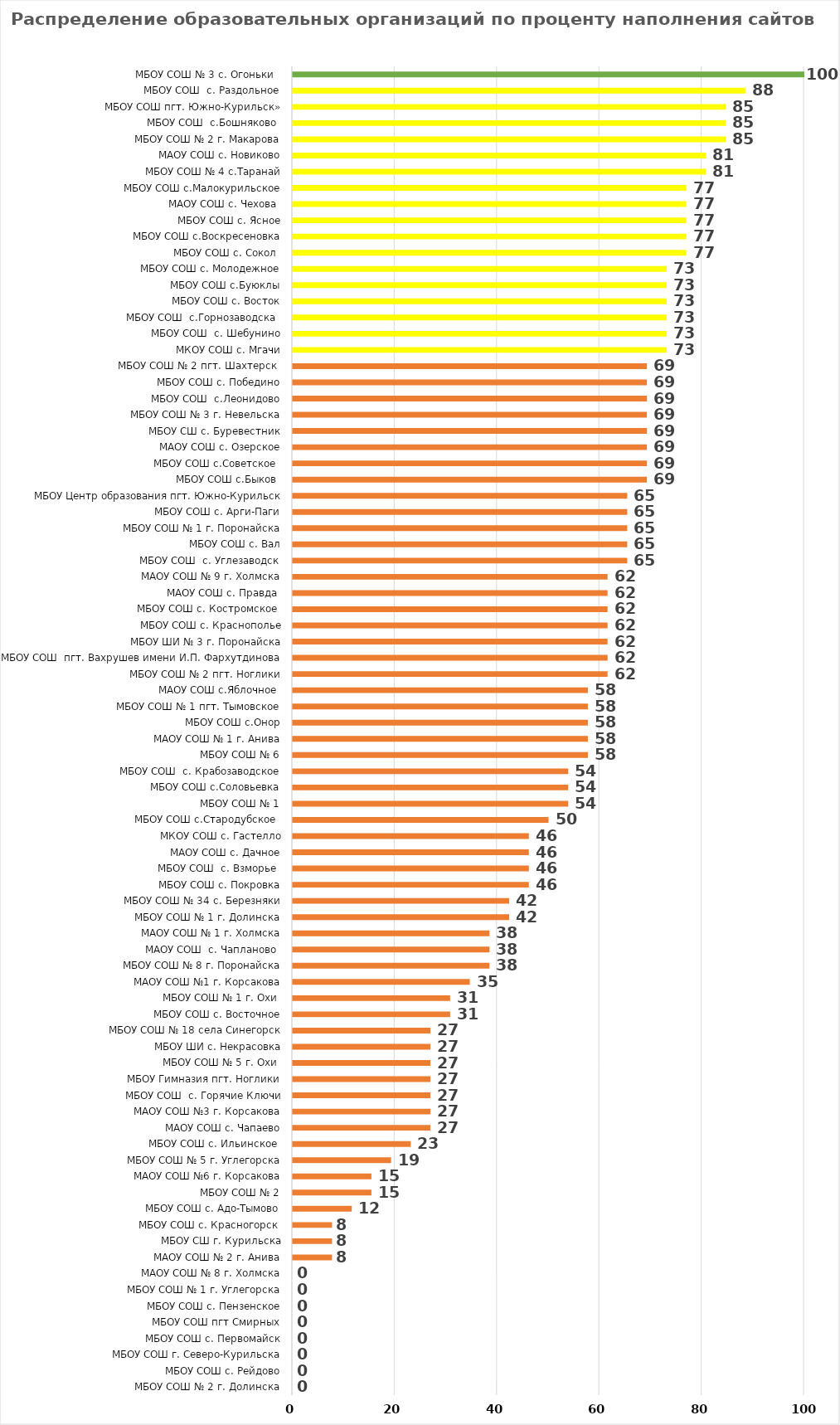
| Category | Series 0 |
|---|---|
| МБОУ СОШ № 2 г. Долинска | 0 |
| МБОУ СОШ с. Рейдово | 0 |
| МБОУ СОШ г. Северо-Курильска | 0 |
| МБОУ СОШ с. Первомайск | 0 |
| МБОУ СОШ пгт Смирных | 0 |
| МБОУ СОШ с. Пензенское | 0 |
| МБОУ СОШ № 1 г. Углегорска | 0 |
| МАОУ СОШ № 8 г. Холмска | 0 |
| МАОУ СОШ № 2 г. Анива | 7.692 |
| МБОУ СШ г. Курильска | 7.692 |
| МБОУ СОШ с. Красногорск  | 7.692 |
| МБОУ СОШ с. Адо-Тымово | 11.538 |
| МБОУ СОШ № 2 | 15.385 |
| МАОУ СОШ №6 г. Корсакова | 15.385 |
| МБОУ СОШ № 5 г. Углегорска | 19.231 |
| МБОУ СОШ с. Ильинское  | 23.077 |
| МАОУ СОШ с. Чапаево | 26.923 |
| МАОУ СОШ №3 г. Корсакова | 26.923 |
| МБОУ СОШ  с. Горячие Ключи | 26.923 |
| МБОУ Гимназия пгт. Ноглики | 26.923 |
| МБОУ СОШ № 5 г. Охи  | 26.923 |
| МБОУ ШИ с. Некрасовка | 26.923 |
| МБОУ СОШ № 18 села Синегорск | 26.923 |
| МБОУ СОШ с. Восточное | 30.769 |
| МБОУ СОШ № 1 г. Охи  | 30.769 |
| МАОУ СОШ №1 г. Корсакова | 34.615 |
| МБОУ СОШ № 8 г. Поронайска | 38.462 |
| МАОУ СОШ  с. Чапланово  | 38.462 |
| МАОУ СОШ № 1 г. Холмска | 38.462 |
| МБОУ СОШ № 1 г. Долинска | 42.308 |
| МБОУ СОШ № 34 с. Березняки | 42.308 |
| МБОУ СОШ с. Покровка | 46.154 |
| МБОУ СОШ  с. Взморье  | 46.154 |
| МАОУ СОШ с. Дачное | 46.154 |
| МКОУ СОШ с. Гастелло | 46.154 |
| МБОУ СОШ с.Стародубское  | 50 |
| МБОУ СОШ № 1 | 53.846 |
| МБОУ СОШ с.Соловьевка | 53.846 |
| МБОУ СОШ  с. Крабозаводское | 53.846 |
| МБОУ СОШ № 6 | 57.692 |
| МАОУ СОШ № 1 г. Анива | 57.692 |
| МБОУ СОШ с.Онор | 57.692 |
| МБОУ СОШ № 1 пгт. Тымовское | 57.692 |
| МАОУ СОШ с.Яблочное  | 57.692 |
| МБОУ СОШ № 2 пгт. Ноглики | 61.538 |
| МБОУ СОШ  пгт. Вахрушев имени И.П. Фархутдинова | 61.538 |
| МБОУ ШИ № 3 г. Поронайска | 61.538 |
| МБОУ СОШ с. Краснополье | 61.538 |
| МБОУ СОШ с. Костромское  | 61.538 |
| МАОУ СОШ с. Правда  | 61.538 |
| МАОУ СОШ № 9 г. Холмска | 61.538 |
| МБОУ СОШ  с. Углезаводск | 65.385 |
| МБОУ СОШ с. Вал | 65.385 |
| МБОУ СОШ № 1 г. Поронайска | 65.385 |
| МБОУ СОШ с. Арги-Паги | 65.385 |
| МБОУ Центр образования пгт. Южно-Курильск | 65.385 |
| МБОУ СОШ с.Быков  | 69.231 |
| МБОУ СОШ с.Советское  | 69.231 |
| МАОУ СОШ с. Озерское | 69.231 |
| МБОУ СШ с. Буревестник | 69.231 |
| МБОУ СОШ № 3 г. Невельска | 69.231 |
| МБОУ СОШ  с.Леонидово | 69.231 |
| МБОУ СОШ с. Победино | 69.231 |
| МБОУ СОШ № 2 пгт. Шахтерск  | 69.231 |
| МКОУ СОШ с. Мгачи | 73.077 |
| МБОУ СОШ  с. Шебунино | 73.077 |
| МБОУ СОШ  с.Горнозаводска  | 73.077 |
| МБОУ СОШ с. Восток | 73.077 |
| МБОУ СОШ с.Буюклы | 73.077 |
| МБОУ СОШ с. Молодежное | 73.077 |
| МБОУ СОШ с. Сокол  | 76.923 |
| МБОУ СОШ с.Воскресеновка | 76.923 |
| МБОУ СОШ с. Ясное | 76.923 |
| МАОУ СОШ с. Чехова  | 76.923 |
| МБОУ СОШ с.Малокурильское | 76.923 |
| МБОУ СОШ № 4 с.Таранай | 80.769 |
| МАОУ СОШ с. Новиково | 80.769 |
| МБОУ СОШ № 2 г. Макарова | 84.615 |
| МБОУ СОШ  с.Бошняково  | 84.615 |
| МБОУ СОШ пгт. Южно-Курильск» | 84.615 |
| МБОУ СОШ  с. Раздольное | 88.462 |
|  МБОУ СОШ № 3 с. Огоньки   | 100 |